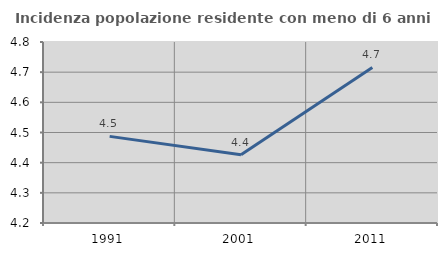
| Category | Incidenza popolazione residente con meno di 6 anni |
|---|---|
| 1991.0 | 4.487 |
| 2001.0 | 4.427 |
| 2011.0 | 4.716 |